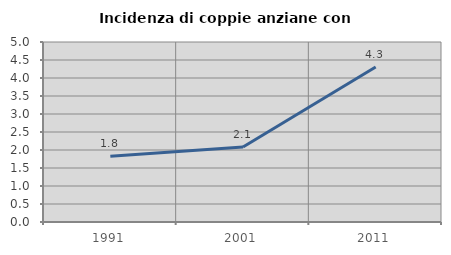
| Category | Incidenza di coppie anziane con figli |
|---|---|
| 1991.0 | 1.825 |
| 2001.0 | 2.083 |
| 2011.0 | 4.305 |